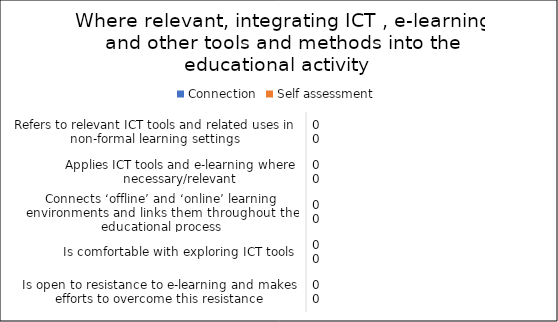
| Category | Connection | Self assessment |
|---|---|---|
| Refers to relevant ICT tools and related uses in non-formal learning settings | 0 | 0 |
| Applies ICT tools and e-learning where necessary/relevant | 0 | 0 |
| Connects ‘offline’ and ‘online’ learning environments and links them throughout the educational process | 0 | 0 |
| Is comfortable with exploring ICT tools | 0 | 0 |
| Is open to resistance to e-learning and makes efforts to overcome this resistance | 0 | 0 |